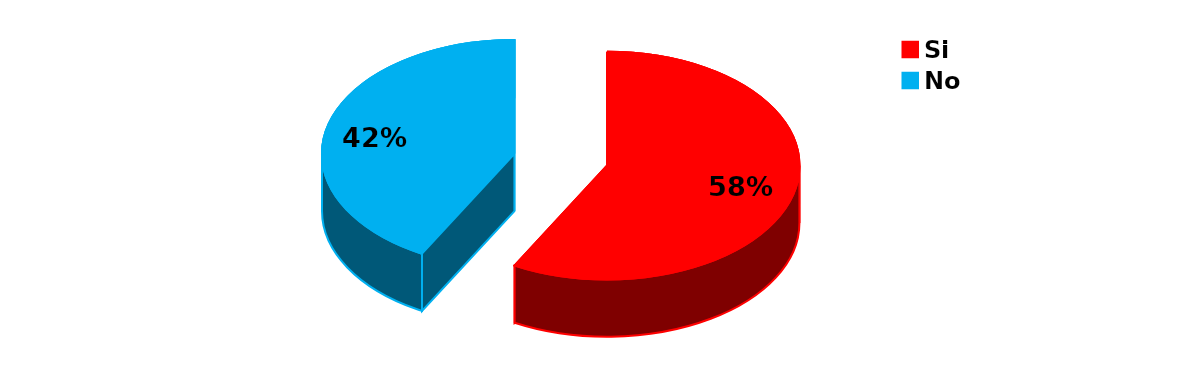
| Category | Series 0 |
|---|---|
| Si | 669 |
| No | 485 |